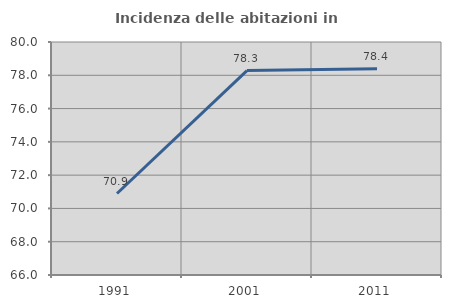
| Category | Incidenza delle abitazioni in proprietà  |
|---|---|
| 1991.0 | 70.896 |
| 2001.0 | 78.281 |
| 2011.0 | 78.387 |